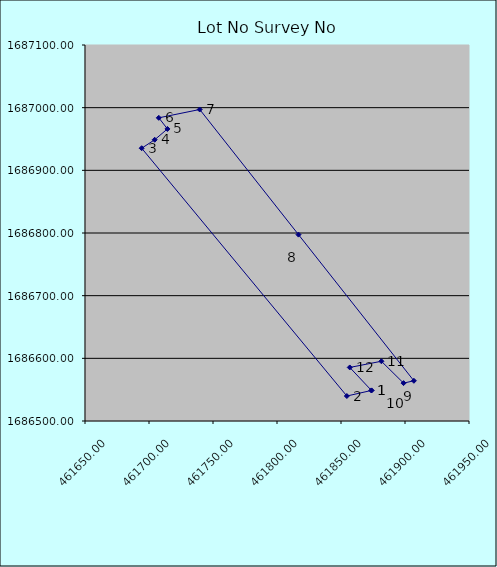
| Category | 435076 |
|---|---|
| 461873.7955 | 1686548.758 |
| 461854.5755 | 1686539.858 |
| 461694.2755 | 1686935.288 |
| 461704.4555 | 1686948.788 |
| 461714.3955 | 1686966.068 |
| 461707.6555000001 | 1686983.798 |
| 461739.6355 | 1686997.098 |
| 461816.7855 | 1686797.428 |
| 461906.9355 | 1686564.178 |
| 461898.8755000001 | 1686560.448 |
| 461881.5555000001 | 1686595.338 |
| 461856.8555000001 | 1686585.448 |
| 461873.7955 | 1686548.758 |